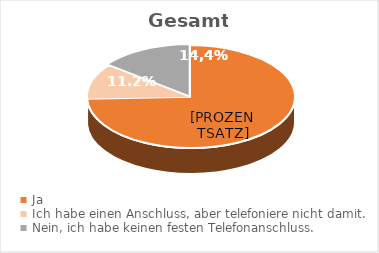
| Category | Series 0 |
|---|---|
| Ja | 74.4 |
| Ich habe einen Anschluss, aber telefoniere nicht damit. | 11.2 |
| Nein, ich habe keinen festen Telefonanschluss. | 14.4 |